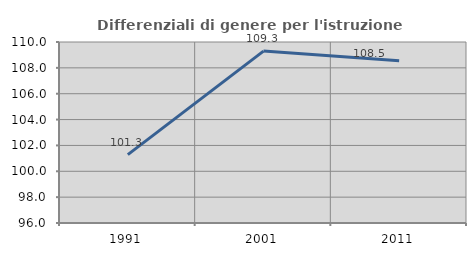
| Category | Differenziali di genere per l'istruzione superiore |
|---|---|
| 1991.0 | 101.287 |
| 2001.0 | 109.297 |
| 2011.0 | 108.548 |